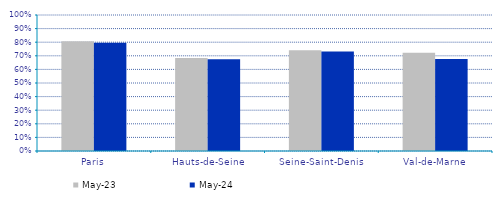
| Category | mai-23 | mai-24 |
|---|---|---|
| Paris | 0.807 | 0.795 |
| Hauts-de-Seine | 0.684 | 0.675 |
| Seine-Saint-Denis | 0.741 | 0.732 |
| Val-de-Marne | 0.722 | 0.676 |